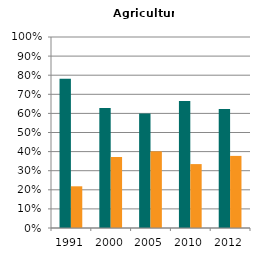
| Category | Male | Female |
|---|---|---|
| 1991.0 | 0.782 | 0.218 |
| 2000.0 | 0.628 | 0.372 |
| 2005.0 | 0.599 | 0.401 |
| 2010.0 | 0.665 | 0.335 |
| 2012.0 | 0.623 | 0.377 |